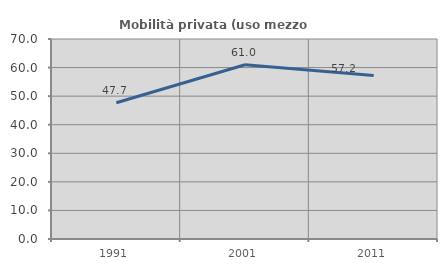
| Category | Mobilità privata (uso mezzo privato) |
|---|---|
| 1991.0 | 47.679 |
| 2001.0 | 60.982 |
| 2011.0 | 57.247 |